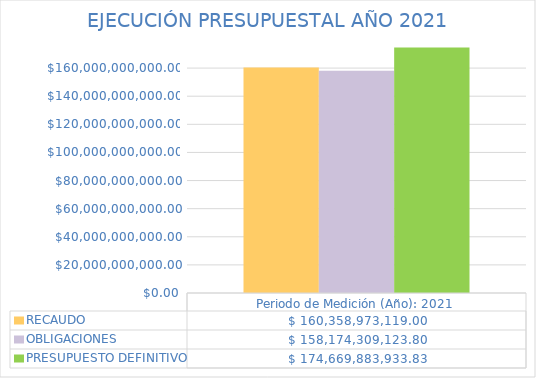
| Category | RECAUDO | OBLIGACIONES | PRESUPUESTO DEFINITIVO |
|---|---|---|---|
| Periodo de Medición (Año): 2021 | 160358973119 | 158174309123.8 | 174669883933.83 |